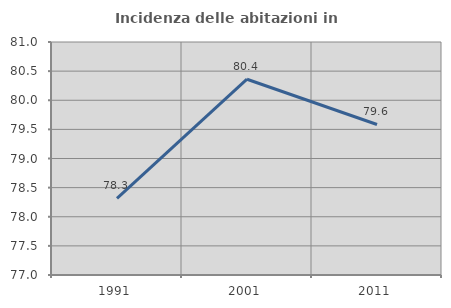
| Category | Incidenza delle abitazioni in proprietà  |
|---|---|
| 1991.0 | 78.314 |
| 2001.0 | 80.361 |
| 2011.0 | 79.584 |